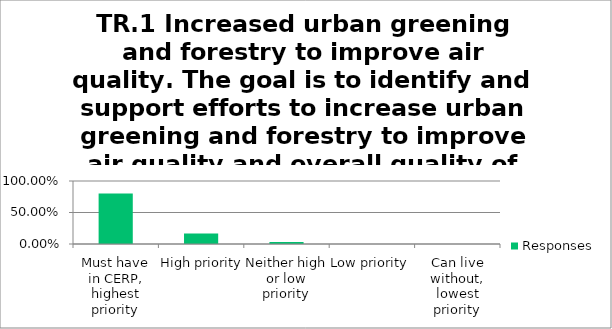
| Category | Responses |
|---|---|
| Must have in CERP, highest priority | 0.8 |
| High priority | 0.167 |
| Neither high or low priority | 0.033 |
| Low priority | 0 |
| Can live without, lowest priority | 0 |